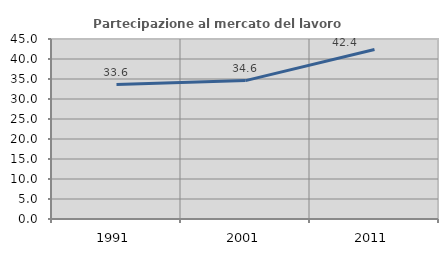
| Category | Partecipazione al mercato del lavoro  femminile |
|---|---|
| 1991.0 | 33.6 |
| 2001.0 | 34.599 |
| 2011.0 | 42.358 |